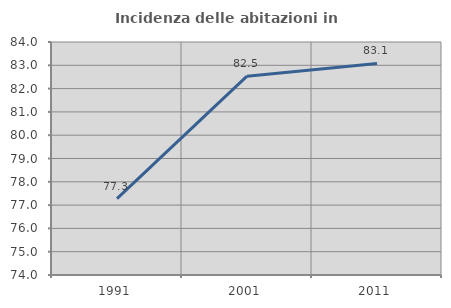
| Category | Incidenza delle abitazioni in proprietà  |
|---|---|
| 1991.0 | 77.274 |
| 2001.0 | 82.535 |
| 2011.0 | 83.078 |